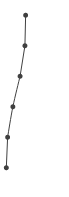
| Category | Series 0 |
|---|---|
| 0.32094350715557957 | 1 |
| 0.3093888556131817 | 2 |
| 0.22952160072546463 | 3 |
| 0.11145594081825268 | 4 |
| 0.024984889101593983 | 5 |
| 0.0036775075257751543 | 6 |